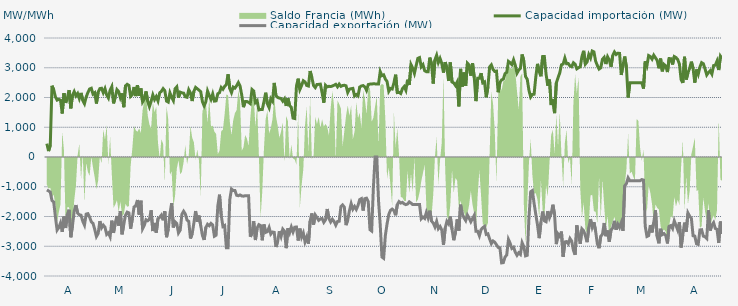
| Category | Capacidad importación (MW) | Capacidad exportación (MW) |
|---|---|---|
| 0 | 449.25 | -1108.333 |
| 1900-01-01 | 200 | -1139.583 |
| 1900-01-02 | 395.833 | -1179.167 |
| 1900-01-03 | 2393.75 | -1462.5 |
| 1900-01-04 | 2262.25 | -1512.5 |
| 1900-01-05 | 2020.833 | -2007.167 |
| 1900-01-06 | 1912.5 | -2455.208 |
| 1900-01-07 | 1939.583 | -2371.125 |
| 1900-01-08 | 1908.333 | -2217.958 |
| 1900-01-09 | 1462.5 | -2517.542 |
| 1900-01-10 | 2145.208 | -2000.417 |
| 1900-01-11 | 1820.833 | -2386.167 |
| 1900-01-12 | 1983.333 | -1930.75 |
| 1900-01-13 | 2245.833 | -1772.917 |
| 1900-01-14 | 1635.417 | -2697.5 |
| 1900-01-15 | 2079.167 | -2299.625 |
| 1900-01-16 | 2200 | -1818.75 |
| 1900-01-17 | 2052.083 | -1616.667 |
| 1900-01-18 | 2133.333 | -1885.417 |
| 1900-01-19 | 1962.5 | -1940.792 |
| 1900-01-20 | 2154.167 | -1955.875 |
| 1900-01-21 | 1906.25 | -2160.458 |
| 1900-01-22 | 1791.667 | -2289.583 |
| 1900-01-23 | 2014.583 | -1920.333 |
| 1900-01-24 | 2166.667 | -1904.167 |
| 1900-01-25 | 2285.417 | -2016.25 |
| 1900-01-26 | 2310.417 | -2177.917 |
| 1900-01-27 | 2114.583 | -2230.875 |
| 1900-01-28 | 2160.417 | -2431.625 |
| 1900-01-29 | 1797.917 | -2674.417 |
| 1900-01-30 | 2180.625 | -2574 |
| 1900-01-31 | 2300 | -2155.333 |
| 1900-02-01 | 2310.417 | -2380.708 |
| 1900-02-02 | 2160.417 | -2290.5 |
| 1900-02-03 | 2295.833 | -2360.958 |
| 1900-02-04 | 2083.333 | -2603 |
| 1900-02-05 | 1983.333 | -2551.458 |
| 1900-02-06 | 2243.75 | -2680.375 |
| 1900-02-07 | 2364.583 | -2139.583 |
| 1900-02-08 | 1802.083 | -2551.375 |
| 1900-02-09 | 2012.5 | -2222.583 |
| 1900-02-10 | 2264.583 | -1983.333 |
| 1900-02-11 | 2200 | -2304.167 |
| 1900-02-12 | 1991.667 | -1823 |
| 1900-02-13 | 2139.583 | -2598.667 |
| 1900-02-14 | 1674.583 | -2262.5 |
| 1900-02-15 | 2391.667 | -1958.333 |
| 1900-02-16 | 2442.875 | -1852.083 |
| 1900-02-17 | 2406.25 | -1879.167 |
| 1900-02-18 | 2035.417 | -2408.5 |
| 1900-02-19 | 2093.75 | -2077.083 |
| 1900-02-20 | 2353.042 | -1679.167 |
| 1900-02-21 | 2047.917 | -1637.5 |
| 1900-02-22 | 2414.917 | -1445.833 |
| 1900-02-23 | 2054.167 | -1935.417 |
| 1900-02-24 | 2304.167 | -1468.75 |
| 1900-02-25 | 1852.083 | -2413.583 |
| 1900-02-26 | 1950 | -2298.583 |
| 1900-02-27 | 2204.167 | -2108.333 |
| 1900-02-28 | 1870.833 | -2142.875 |
| 1900-02-28 | 1693.75 | -2094.083 |
| 1900-03-01 | 1875 | -1793.75 |
| 1900-03-02 | 2087.5 | -2489.25 |
| 1900-03-03 | 1929.167 | -2216.167 |
| 1900-03-04 | 2031.25 | -2542 |
| 1900-03-05 | 1885.417 | -2072.833 |
| 1900-03-06 | 2156.25 | -2029.167 |
| 1900-03-07 | 2208.333 | -1953 |
| 1900-03-08 | 2297.917 | -2127.083 |
| 1900-03-09 | 2229.167 | -1822.917 |
| 1900-03-10 | 1879.167 | -2695.583 |
| 1900-03-11 | 1845.833 | -2427.667 |
| 1900-03-12 | 2156.25 | -1908.417 |
| 1900-03-13 | 2010.417 | -1551.375 |
| 1900-03-14 | 1897.625 | -2367.333 |
| 1900-03-15 | 2291.667 | -2179.167 |
| 1900-03-16 | 2358.333 | -2236.833 |
| 1900-03-17 | 1997.917 | -2551.708 |
| 1900-03-18 | 2179.167 | -2457.875 |
| 1900-03-19 | 2156.25 | -1922.667 |
| 1900-03-20 | 2145.833 | -1823.917 |
| 1900-03-21 | 2022.917 | -1916.417 |
| 1900-03-22 | 2008.333 | -2121.167 |
| 1900-03-23 | 2260.417 | -2164.667 |
| 1900-03-24 | 2152.083 | -2739.958 |
| 1900-03-25 | 1881 | -2582.833 |
| 1900-03-26 | 2206.25 | -2222.083 |
| 1900-03-27 | 2339.583 | -1816.667 |
| 1900-03-28 | 2293.75 | -2177.833 |
| 1900-03-29 | 2245.833 | -1968.75 |
| 1900-03-30 | 2195.833 | -2304.458 |
| 1900-03-31 | 1858.208 | -2638.917 |
| 1900-04-01 | 1718.75 | -2788.083 |
| 1900-04-02 | 1858.333 | -2369.542 |
| 1900-04-03 | 2216.667 | -2260.583 |
| 1900-04-04 | 2066.667 | -2309.375 |
| 1900-04-05 | 1935.417 | -2231 |
| 1900-04-06 | 2118.292 | -2285.25 |
| 1900-04-07 | 1879.583 | -2663 |
| 1900-04-08 | 1887.5 | -2627.5 |
| 1900-04-09 | 2127.083 | -1647.917 |
| 1900-04-10 | 2162.5 | -1266.667 |
| 1900-04-11 | 2338.667 | -1964.583 |
| 1900-04-12 | 2277.083 | -2337.25 |
| 1900-04-13 | 2373.75 | -2304.167 |
| 1900-04-14 | 2435.083 | -3048.333 |
| 1900-04-15 | 2780.708 | -3048.208 |
| 1900-04-16 | 2300 | -1435 |
| 1900-04-17 | 2164.583 | -1077.083 |
| 1900-04-18 | 2350 | -1125 |
| 1900-04-19 | 2314.583 | -1125 |
| 1900-04-20 | 2395.625 | -1287.5 |
| 1900-04-21 | 2501.583 | -1302.083 |
| 1900-04-22 | 2389.417 | -1275 |
| 1900-04-23 | 2080.375 | -1308.333 |
| 1900-04-24 | 1675 | -1316.667 |
| 1900-04-25 | 1862.5 | -1300 |
| 1900-04-26 | 1866.708 | -1300 |
| 1900-04-27 | 1837.292 | -1300 |
| 1900-04-28 | 1793.75 | -2680.333 |
| 1900-04-29 | 2268.333 | -2563.75 |
| 1900-04-30 | 2217.333 | -2160.333 |
| 1900-05-01 | 1831.25 | -2791.75 |
| 1900-05-02 | 1890.083 | -2386.583 |
| 1900-05-03 | 1581.667 | -2273.25 |
| 1900-05-04 | 1595.833 | -2304.167 |
| 1900-05-05 | 1593.75 | -2799.042 |
| 1900-05-06 | 1860.75 | -2268.667 |
| 1900-05-07 | 2160.5 | -2533.875 |
| 1900-05-08 | 1785.417 | -2508.667 |
| 1900-05-09 | 1658.333 | -2368.167 |
| 1900-05-10 | 1958.333 | -2590.5 |
| 1900-05-11 | 1875.083 | -2522 |
| 1900-05-12 | 2489.792 | -2532.75 |
| 1900-05-13 | 2064.583 | -3024.833 |
| 1900-05-14 | 2001.333 | -2838.125 |
| 1900-05-15 | 1979.167 | -2490.417 |
| 1900-05-16 | 1966.667 | -2671.375 |
| 1900-05-17 | 1877.792 | -2424.333 |
| 1900-05-18 | 1957.75 | -2493.167 |
| 1900-05-19 | 1716.667 | -3063.708 |
| 1900-05-20 | 1978.5 | -2394.708 |
| 1900-05-21 | 1729.167 | -2549 |
| 1900-05-22 | 1666.667 | -2355.5 |
| 1900-05-23 | 1308.333 | -2520.458 |
| 1900-05-24 | 1293.75 | -2359.417 |
| 1900-05-25 | 2383.833 | -2353.167 |
| 1900-05-26 | 2632.25 | -2807.083 |
| 1900-05-27 | 2269.167 | -2407.042 |
| 1900-05-28 | 2400.75 | -2695.042 |
| 1900-05-29 | 2564.417 | -2553.583 |
| 1900-05-30 | 2525.583 | -2853.583 |
| 1900-05-31 | 2404.5 | -2690.292 |
| 1900-06-01 | 2386.042 | -2912.083 |
| 1900-06-02 | 2890.042 | -2155.708 |
| 1900-06-03 | 2668.625 | -1896.5 |
| 1900-06-04 | 2403.083 | -2272.75 |
| 1900-06-05 | 2332.833 | -1950 |
| 1900-06-06 | 2437.5 | -2037.5 |
| 1900-06-07 | 2441.667 | -2129 |
| 1900-06-08 | 2450 | -2079.167 |
| 1900-06-09 | 2159.292 | -2066.667 |
| 1900-06-10 | 1825 | -2195.667 |
| 1900-06-11 | 2412.5 | -2108.333 |
| 1900-06-12 | 2355.5 | -1747.917 |
| 1900-06-13 | 2377.083 | -2070.833 |
| 1900-06-14 | 2366.667 | -2185.333 |
| 1900-06-15 | 2387.5 | -2091.667 |
| 1900-06-16 | 2412.5 | -2164.583 |
| 1900-06-17 | 2443 | -2291.292 |
| 1900-06-18 | 2360.417 | -2168.75 |
| 1900-06-19 | 2450 | -2160.417 |
| 1900-06-20 | 2375 | -1668.75 |
| 1900-06-21 | 2402.083 | -1612.5 |
| 1900-06-22 | 2412 | -1683.333 |
| 1900-06-23 | 2393.75 | -2289.583 |
| 1900-06-24 | 2168.625 | -2114.083 |
| 1900-06-25 | 2281.25 | -1800 |
| 1900-06-26 | 2295.833 | -1566.667 |
| 1900-06-27 | 2306.25 | -1754.167 |
| 1900-06-28 | 2050 | -1662.5 |
| 1900-06-29 | 2100 | -1762.5 |
| 1900-06-30 | 2052.083 | -1629.167 |
| 1900-07-01 | 2351.708 | -1429.167 |
| 1900-07-02 | 2387.5 | -1400 |
| 1900-07-03 | 2400 | -1800 |
| 1900-07-04 | 2355.875 | -1400 |
| 1900-07-05 | 2239.583 | -1383.333 |
| 1900-07-06 | 2435.417 | -1500 |
| 1900-07-07 | 2450 | -2442.875 |
| 1900-07-08 | 2455.875 | -2487.042 |
| 1900-07-09 | 2459.792 | -1025 |
| 1900-07-10 | 2457.708 | 0 |
| 1900-07-11 | 2450 | 0 |
| 1900-07-12 | 2450 | -1462.5 |
| 1900-07-13 | 2870.833 | -2280.5 |
| 1900-07-14 | 2735.958 | -3362.458 |
| 1900-07-15 | 2761.833 | -3404.708 |
| 1900-07-16 | 2618.708 | -2638.958 |
| 1900-07-17 | 2538.583 | -2247.25 |
| 1900-07-18 | 2208.333 | -1933.333 |
| 1900-07-19 | 2304.167 | -1791.667 |
| 1900-07-20 | 2285.083 | -1750 |
| 1900-07-21 | 2485.708 | -1800 |
| 1900-07-22 | 2766.917 | -1958.333 |
| 1900-07-23 | 2164.458 | -1600 |
| 1900-07-24 | 2172.792 | -1500 |
| 1900-07-25 | 2133.333 | -1550 |
| 1900-07-26 | 2297.917 | -1525 |
| 1900-07-27 | 2366.667 | -1575 |
| 1900-07-28 | 2243.25 | -1600 |
| 1900-07-29 | 2598.52 | -1580 |
| 1900-07-30 | 2420.167 | -1508.333 |
| 1900-07-31 | 3106.25 | -1550 |
| 1900-08-01 | 2984.667 | -1600 |
| 1900-08-02 | 2812.083 | -1600 |
| 1900-08-03 | 3067.5 | -1600 |
| 1900-08-04 | 3316.25 | -1600 |
| 1900-08-05 | 3341.25 | -1600 |
| 1900-08-06 | 3032 | -2077.083 |
| 1900-08-07 | 3104.417 | -2016.75 |
| 1900-08-08 | 2900 | -2064.583 |
| 1900-08-09 | 2867 | -1862.5 |
| 1900-08-10 | 2867 | -2045.833 |
| 1900-08-11 | 3341.083 | -1804.167 |
| 1900-08-12 | 3131.083 | -2154.167 |
| 1900-08-13 | 2468.083 | -2216.667 |
| 1900-08-14 | 3265.167 | -2350 |
| 1900-08-15 | 3420.583 | -2164.833 |
| 1900-08-16 | 3174.333 | -2409.417 |
| 1900-08-17 | 3313.292 | -2335.75 |
| 1900-08-18 | 3146.333 | -2455.542 |
| 1900-08-19 | 2838 | -2955.75 |
| 1900-08-20 | 3188.5 | -2388.25 |
| 1900-08-21 | 2992.083 | -2162.5 |
| 1900-08-22 | 2556.125 | -2248.583 |
| 1900-08-23 | 3177.25 | -2002.917 |
| 1900-08-24 | 2521.083 | -2429.667 |
| 1900-08-25 | 2489.167 | -2797.208 |
| 1900-08-26 | 2404.583 | -2531.417 |
| 1900-08-27 | 2519.708 | -2094.75 |
| 1900-08-28 | 1700 | -2472.792 |
| 1900-08-29 | 2961.583 | -1602.083 |
| 1900-08-30 | 2367.125 | -1916.667 |
| 1900-08-31 | 2839.792 | -2043.75 |
| 1900-09-01 | 2395.833 | -2137.5 |
| 1900-09-02 | 3152.583 | -1952.083 |
| 1900-09-03 | 3090.75 | -2052.083 |
| 1900-09-04 | 2732.167 | -2177.083 |
| 1900-09-05 | 3154.208 | -2069.625 |
| 1900-09-06 | 2672.375 | -1960.417 |
| 1900-09-07 | 1879.167 | -2497 |
| 1900-09-08 | 2643.583 | -2497 |
| 1900-09-09 | 2643.083 | -2647.583 |
| 1900-09-10 | 2816.917 | -2441.083 |
| 1900-09-11 | 2493.125 | -2374 |
| 1900-09-12 | 2524.458 | -2332.167 |
| 1900-09-13 | 2008.333 | -2601 |
| 1900-09-14 | 2361.875 | -2582.083 |
| 1900-09-15 | 3027.625 | -2755.833 |
| 1900-09-16 | 3096.375 | -2911.667 |
| 1900-09-17 | 2940.417 | -2822.917 |
| 1900-09-18 | 2875 | -2863.5 |
| 1900-09-19 | 2886.833 | -2951.167 |
| 1900-09-20 | 2177.083 | -3040.5 |
| 1900-09-21 | 2503.583 | -3052 |
| 1900-09-22 | 2591.792 | -3558.75 |
| 1900-09-23 | 2617 | -3551.083 |
| 1900-09-24 | 2801.958 | -3364.542 |
| 1900-09-25 | 2846.25 | -3293 |
| 1900-09-26 | 3214.542 | -2770.875 |
| 1900-09-27 | 3169.167 | -2897.917 |
| 1900-09-28 | 3108.042 | -3073.375 |
| 1900-09-29 | 3266.042 | -3032.75 |
| 1900-09-30 | 3083.708 | -3200.292 |
| 1900-10-01 | 2817.875 | -3304.5 |
| 1900-10-02 | 2919.708 | -3219.583 |
| 1900-10-03 | 2976.042 | -3273.667 |
| 1900-10-04 | 3445.625 | -2880.583 |
| 1900-10-05 | 3231.042 | -3016.625 |
| 1900-10-06 | 2703.75 | -3322.875 |
| 1900-10-07 | 2610.417 | -3303 |
| 1900-10-08 | 2240.75 | -2035 |
| 1900-10-09 | 2016.667 | -1167.583 |
| 1900-10-10 | 2102.083 | -1128.25 |
| 1900-10-11 | 2110.417 | -1558.333 |
| 1900-10-12 | 2691.083 | -1930.667 |
| 1900-10-13 | 3131 | -2286.417 |
| 1900-10-14 | 2867 | -2728 |
| 1900-10-15 | 2713.167 | -2194.5 |
| 1900-10-16 | 3375.5 | -1833.333 |
| 1900-10-17 | 3377.833 | -2144.5 |
| 1900-10-18 | 2788.375 | -2175 |
| 1900-10-19 | 2393.917 | -1818.5 |
| 1900-10-20 | 2602.208 | -2041.542 |
| 1900-10-21 | 1745.833 | -1898.542 |
| 1900-10-22 | 1941.667 | -1603.542 |
| 1900-10-23 | 1475 | -1942.833 |
| 1900-10-24 | 2488.208 | -2928.792 |
| 1900-10-25 | 2665.583 | -2587.083 |
| 1900-10-26 | 2824.833 | -2666.708 |
| 1900-10-27 | 3099 | -2507.042 |
| 1900-10-28 | 3125.208 | -3352.792 |
| 1900-10-29 | 3325.625 | -2855.792 |
| 1900-10-30 | 3135.042 | -2844.083 |
| 1900-10-31 | 3141.667 | -2918 |
| 1900-11-01 | 3059.917 | -2739.5 |
| 1900-11-02 | 3034.833 | -2828 |
| 1900-11-03 | 3167.5 | -3136.792 |
| 1900-11-04 | 3121.167 | -3287.208 |
| 1900-11-05 | 2964.583 | -2300 |
| 1900-11-06 | 3002.167 | -2654.417 |
| 1900-11-07 | 3029.042 | -2917.583 |
| 1900-11-08 | 3379.625 | -2416.083 |
| 1900-11-09 | 3570.333 | -2480.292 |
| 1900-11-10 | 3123.292 | -2647.208 |
| 1900-11-11 | 3196.583 | -2862.417 |
| 1900-11-12 | 3445.458 | -2378.958 |
| 1900-11-13 | 3328.083 | -2087.5 |
| 1900-11-14 | 3561 | -2358.667 |
| 1900-11-15 | 3532.125 | -2190.458 |
| 1900-11-16 | 3219.792 | -2497 |
| 1900-11-17 | 3077.292 | -2917.833 |
| 1900-11-18 | 2955.75 | -3065.375 |
| 1900-11-19 | 2997.958 | -2665.292 |
| 1900-11-20 | 3285.292 | -2594.75 |
| 1900-11-21 | 3350.708 | -2217.75 |
| 1900-11-22 | 3125.292 | -2661.542 |
| 1900-11-23 | 3368.292 | -2470.583 |
| 1900-11-24 | 3260.167 | -2844.375 |
| 1900-11-25 | 3034.708 | -2450.625 |
| 1900-11-26 | 3410.458 | -2385 |
| 1900-11-27 | 3529.958 | -2146.167 |
| 1900-11-28 | 3445.25 | -2443.125 |
| 1900-11-29 | 3489.542 | -2260.25 |
| 1900-11-30 | 3481.833 | -2370.583 |
| 1900-12-01 | 2757.125 | -2206.25 |
| 1900-12-02 | 3080.958 | -2481.667 |
| 1900-12-03 | 3376 | -966.667 |
| 1900-12-04 | 3018.208 | -895.833 |
| 1900-12-05 | 2000 | -700 |
| 1900-12-06 | 2497 | -800 |
| 1900-12-07 | 2497 | -800 |
| 1900-12-08 | 2497 | -800 |
| 1900-12-09 | 2497 | -800 |
| 1900-12-10 | 2497 | -800 |
| 1900-12-11 | 2497 | -800 |
| 1900-12-12 | 2497 | -800 |
| 1900-12-13 | 2497 | -758.333 |
| 1900-12-14 | 2300 | -775 |
| 1900-12-15 | 3213.417 | -2319.542 |
| 1900-12-16 | 3069.417 | -2670.458 |
| 1900-12-17 | 3409.708 | -2642.25 |
| 1900-12-18 | 3375.792 | -2289.292 |
| 1900-12-19 | 3289.583 | -2534.75 |
| 1900-12-20 | 3422.208 | -2195.833 |
| 1900-12-21 | 3333.625 | -1791.167 |
| 1900-12-22 | 3246.917 | -2683.292 |
| 1900-12-23 | 2982.792 | -2900.958 |
| 1900-12-24 | 3308.458 | -2412.833 |
| 1900-12-25 | 2878.875 | -2610.083 |
| 1900-12-26 | 3112.042 | -2575.917 |
| 1900-12-27 | 3061.417 | -2634.458 |
| 1900-12-28 | 2855.167 | -2904.792 |
| 1900-12-29 | 3308.833 | -2329.167 |
| 1900-12-30 | 3303.652 | -2303.826 |
| 1900-12-31 | 3110.167 | -2403.208 |
| 1901-01-01 | 3376.167 | -2144.417 |
| 1901-01-02 | 3343.5 | -2295.25 |
| 1901-01-03 | 3275.917 | -2451.667 |
| 1901-01-04 | 3127.583 | -2190.25 |
| 1901-01-05 | 2605.25 | -3040.667 |
| 1901-01-06 | 2486.458 | -2615.667 |
| 1901-01-07 | 3368.375 | -2205.958 |
| 1901-01-08 | 2603.458 | -2511.75 |
| 1901-01-09 | 2832.708 | -1881.25 |
| 1901-01-10 | 2981 | -1991.667 |
| 1901-01-11 | 3204.667 | -2060.667 |
| 1901-01-12 | 2973.333 | -2647.542 |
| 1901-01-13 | 2500.042 | -2659.542 |
| 1901-01-14 | 2939.542 | -2916.042 |
| 1901-01-15 | 2780.917 | -2938.917 |
| 1901-01-16 | 3025.5 | -2450.25 |
| 1901-01-17 | 3172 | -2443 |
| 1901-01-18 | 3135.333 | -2660.625 |
| 1901-01-19 | 2961.375 | -2681.167 |
| 1901-01-20 | 2757.667 | -2739.333 |
| 1901-01-21 | 2839.708 | -1792.708 |
| 1901-01-22 | 2900.083 | -2470.708 |
| 1901-01-23 | 2788.25 | -2287.5 |
| 1901-01-24 | 3073.458 | -2203.667 |
| 1901-01-25 | 3085.417 | -2401.042 |
| 1901-01-26 | 3223.958 | -2429.333 |
| 1901-01-27 | 2923.667 | -2890.167 |
| 1901-01-28 | 3389.417 | -2170.833 |
| 1901-01-29 | 3304.833 | -2587.25 |